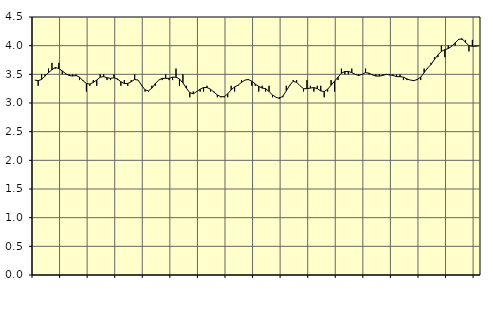
| Category | Piggar | Personliga och kulturella tjänster, SNI 90-98 |
|---|---|---|
| nan | 3.4 | 3.4 |
| 87.0 | 3.3 | 3.39 |
| 87.0 | 3.5 | 3.41 |
| 87.0 | 3.5 | 3.47 |
| nan | 3.6 | 3.53 |
| 88.0 | 3.7 | 3.58 |
| 88.0 | 3.6 | 3.62 |
| 88.0 | 3.7 | 3.6 |
| nan | 3.5 | 3.56 |
| 89.0 | 3.5 | 3.51 |
| 89.0 | 3.5 | 3.48 |
| 89.0 | 3.5 | 3.47 |
| nan | 3.5 | 3.48 |
| 90.0 | 3.4 | 3.45 |
| 90.0 | 3.4 | 3.39 |
| 90.0 | 3.2 | 3.34 |
| nan | 3.3 | 3.33 |
| 91.0 | 3.4 | 3.36 |
| 91.0 | 3.3 | 3.4 |
| 91.0 | 3.5 | 3.45 |
| nan | 3.5 | 3.46 |
| 92.0 | 3.4 | 3.44 |
| 92.0 | 3.4 | 3.43 |
| 92.0 | 3.5 | 3.44 |
| nan | 3.4 | 3.42 |
| 93.0 | 3.3 | 3.37 |
| 93.0 | 3.4 | 3.34 |
| 93.0 | 3.3 | 3.34 |
| nan | 3.4 | 3.37 |
| 94.0 | 3.5 | 3.41 |
| 94.0 | 3.4 | 3.4 |
| 94.0 | 3.3 | 3.31 |
| nan | 3.2 | 3.23 |
| 95.0 | 3.2 | 3.21 |
| 95.0 | 3.3 | 3.26 |
| 95.0 | 3.3 | 3.34 |
| nan | 3.4 | 3.4 |
| 96.0 | 3.4 | 3.43 |
| 96.0 | 3.5 | 3.43 |
| 96.0 | 3.4 | 3.43 |
| nan | 3.4 | 3.45 |
| 97.0 | 3.6 | 3.45 |
| 97.0 | 3.3 | 3.42 |
| 97.0 | 3.5 | 3.35 |
| nan | 3.3 | 3.26 |
| 98.0 | 3.1 | 3.18 |
| 98.0 | 3.2 | 3.16 |
| 98.0 | 3.2 | 3.2 |
| nan | 3.2 | 3.24 |
| 99.0 | 3.2 | 3.27 |
| 99.0 | 3.3 | 3.27 |
| 99.0 | 3.2 | 3.24 |
| nan | 3.2 | 3.19 |
| 0.0 | 3.1 | 3.14 |
| 0.0 | 3.1 | 3.11 |
| 0.0 | 3.1 | 3.11 |
| nan | 3.1 | 3.16 |
| 1.0 | 3.3 | 3.23 |
| 1.0 | 3.2 | 3.28 |
| 1.0 | 3.3 | 3.31 |
| nan | 3.4 | 3.36 |
| 2.0 | 3.4 | 3.4 |
| 2.0 | 3.4 | 3.41 |
| 2.0 | 3.3 | 3.38 |
| nan | 3.3 | 3.33 |
| 3.0 | 3.2 | 3.29 |
| 3.0 | 3.3 | 3.26 |
| 3.0 | 3.2 | 3.25 |
| nan | 3.3 | 3.2 |
| 4.0 | 3.1 | 3.14 |
| 4.0 | 3.1 | 3.1 |
| 4.0 | 3.1 | 3.08 |
| nan | 3.1 | 3.12 |
| 5.0 | 3.3 | 3.21 |
| 5.0 | 3.3 | 3.31 |
| 5.0 | 3.4 | 3.38 |
| nan | 3.4 | 3.36 |
| 6.0 | 3.3 | 3.3 |
| 6.0 | 3.2 | 3.25 |
| 6.0 | 3.4 | 3.25 |
| nan | 3.3 | 3.26 |
| 7.0 | 3.2 | 3.27 |
| 7.0 | 3.3 | 3.25 |
| 7.0 | 3.3 | 3.21 |
| nan | 3.1 | 3.2 |
| 8.0 | 3.2 | 3.24 |
| 8.0 | 3.4 | 3.31 |
| 8.0 | 3.2 | 3.38 |
| nan | 3.4 | 3.45 |
| 9.0 | 3.6 | 3.52 |
| 9.0 | 3.5 | 3.55 |
| 9.0 | 3.5 | 3.55 |
| nan | 3.6 | 3.53 |
| 10.0 | 3.5 | 3.5 |
| 10.0 | 3.5 | 3.48 |
| 10.0 | 3.5 | 3.5 |
| nan | 3.6 | 3.53 |
| 11.0 | 3.5 | 3.52 |
| 11.0 | 3.5 | 3.49 |
| 11.0 | 3.5 | 3.47 |
| nan | 3.5 | 3.47 |
| 12.0 | 3.5 | 3.48 |
| 12.0 | 3.5 | 3.5 |
| 12.0 | 3.5 | 3.49 |
| nan | 3.5 | 3.48 |
| 13.0 | 3.5 | 3.46 |
| 13.0 | 3.5 | 3.46 |
| 13.0 | 3.4 | 3.45 |
| nan | 3.4 | 3.42 |
| 14.0 | 3.4 | 3.4 |
| 14.0 | 3.4 | 3.39 |
| 14.0 | 3.4 | 3.41 |
| nan | 3.4 | 3.45 |
| 15.0 | 3.6 | 3.53 |
| 15.0 | 3.6 | 3.61 |
| 15.0 | 3.7 | 3.67 |
| nan | 3.8 | 3.76 |
| 16.0 | 3.8 | 3.84 |
| 16.0 | 4 | 3.9 |
| 16.0 | 3.8 | 3.93 |
| nan | 4 | 3.95 |
| 17.0 | 4 | 3.99 |
| 17.0 | 4 | 4.05 |
| 17.0 | 4.1 | 4.11 |
| nan | 4.1 | 4.12 |
| 18.0 | 4.1 | 4.06 |
| 18.0 | 3.9 | 4 |
| 18.0 | 4.1 | 3.99 |
| nan | 4 | 3.99 |
| 19.0 | 4 | 4 |